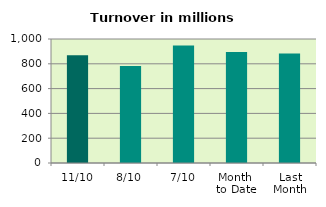
| Category | Series 0 |
|---|---|
| 11/10 | 867.991 |
| 8/10 | 781.909 |
| 7/10 | 948.442 |
| Month 
to Date | 894.777 |
| Last
Month | 883.598 |